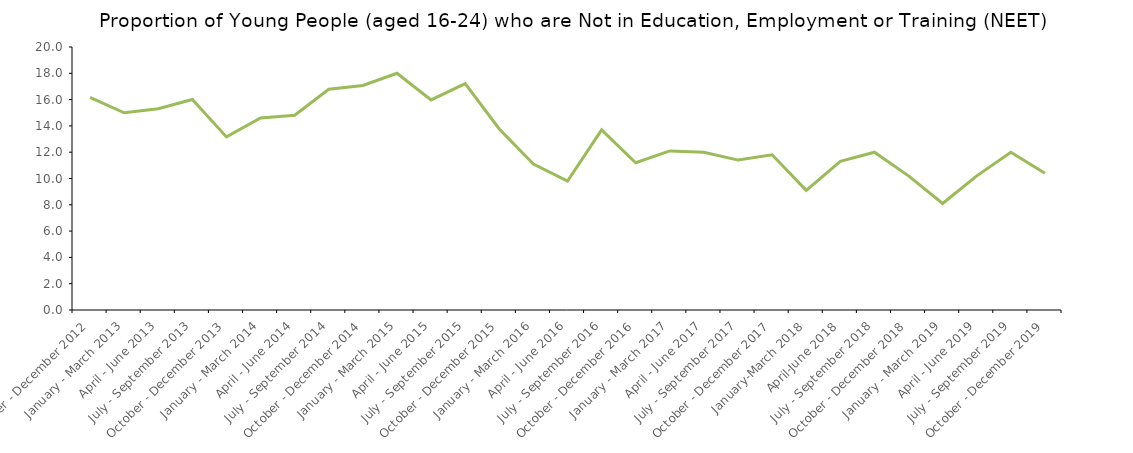
| Category | Series 2 |
|---|---|
| October - December 2012 | 16.178 |
| January - March 2013 | 15 |
| April - June 2013 | 15.3 |
| July - September 2013 | 16.006 |
| October - December 2013 | 13.163 |
| January - March 2014 | 14.6 |
| April - June 2014 | 14.811 |
| July - September 2014 | 16.785 |
| October - December 2014 | 17.073 |
| January - March 2015 | 18 |
| April - June 2015 | 15.972 |
| July - September 2015 | 17.216 |
| October - December 2015 | 13.765 |
| January - March 2016 | 11.1 |
| April - June 2016 | 9.8 |
| July - September 2016 | 13.7 |
| October - December 2016 | 11.2 |
| January - March 2017 | 12.1 |
| April - June 2017 | 12 |
| July - September 2017 | 11.4 |
| October - December 2017 | 11.8 |
| January-March 2018 | 9.1 |
| April-June 2018 | 11.3 |
| July - September 2018 | 12 |
| October - December 2018 | 10.2 |
| January - March 2019 | 8.1 |
| April - June 2019 | 10.2 |
| July - September 2019 | 12 |
| October - December 2019 | 10.4 |